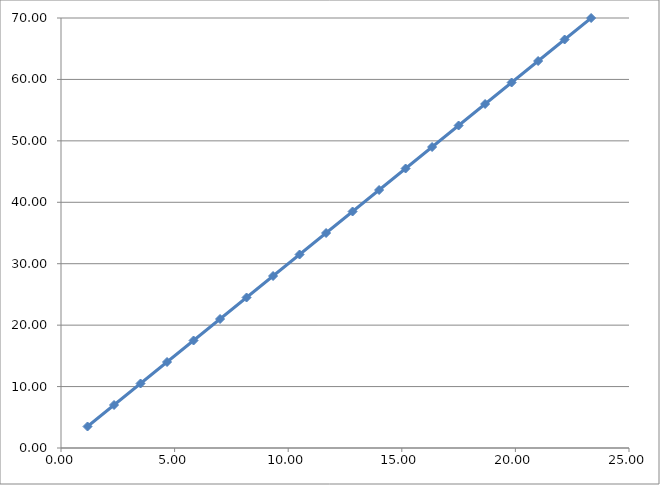
| Category | Series 0 |
|---|---|
| 1.1666666666666667 | 3.5 |
| 2.3333333333333335 | 7 |
| 3.5 | 10.5 |
| 4.666666666666667 | 14 |
| 5.833333333333333 | 17.5 |
| 7.0 | 21 |
| 8.166666666666666 | 24.5 |
| 9.333333333333334 | 28 |
| 10.5 | 31.5 |
| 11.666666666666666 | 35 |
| 12.833333333333334 | 38.5 |
| 14.0 | 42 |
| 15.166666666666666 | 45.5 |
| 16.333333333333332 | 49 |
| 17.5 | 52.5 |
| 18.666666666666668 | 56 |
| 19.833333333333332 | 59.5 |
| 21.0 | 63 |
| 22.166666666666668 | 66.5 |
| 23.333333333333332 | 70 |